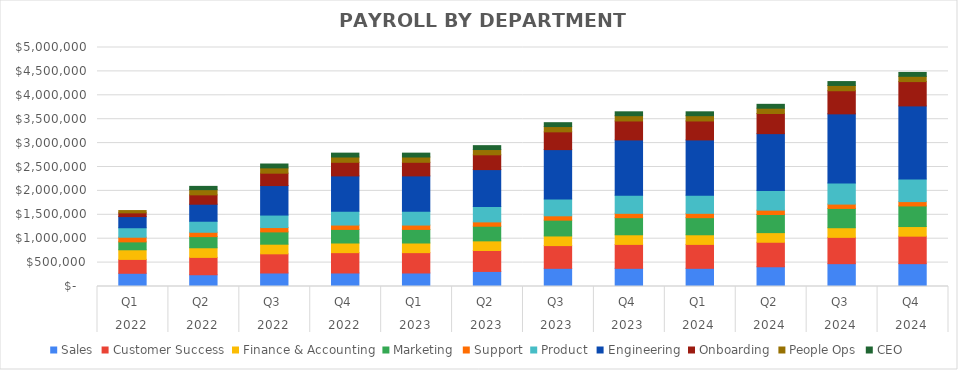
| Category | Sales | Customer Success | Finance & Accounting | Marketing | Support | Product | Engineering | Onboarding | People Ops | CEO |
|---|---|---|---|---|---|---|---|---|---|---|
| 0 | 276249.99 | 290328.92 | 201499.98 | 165482.88 | 97360.24 | 198249.99 | 233088.89 | 78419.34 | 48087.9 | 0 |
| 1 | 245923.65 | 363042.99 | 201499.98 | 232916.61 | 91234.74 | 230749.99 | 355874.98 | 196083.31 | 108784.74 | 68611.1 |
| 2 | 282750 | 400833.26 | 201499.98 | 257291.61 | 91000.02 | 261083.32 | 616940.84 | 259458.29 | 110500.02 | 81249.99 |
| 3 | 282750 | 425749.92 | 201499.98 | 284374.95 | 91000.02 | 289249.98 | 739374.99 | 284374.95 | 110500.02 | 81249.99 |
| 4 | 282750 | 425749.92 | 201499.98 | 284374.95 | 91000.02 | 289249.98 | 739374.99 | 284374.95 | 110500.02 | 81249.99 |
| 5 | 315250 | 438208.25 | 201499.98 | 306041.61 | 91000.02 | 321749.98 | 771874.99 | 309291.61 | 110500.02 | 81249.99 |
| 6 | 380250 | 475583.24 | 201499.98 | 330416.61 | 91000.02 | 352083.31 | 1032940.85 | 371583.26 | 110500.02 | 81249.99 |
| 7 | 380250 | 500499.9 | 201499.98 | 357499.95 | 91000.02 | 380249.97 | 1155375 | 396499.92 | 110500.02 | 81249.99 |
| 8 | 380250 | 500499.9 | 201499.98 | 357499.95 | 91000.02 | 380249.97 | 1155375 | 396499.92 | 110500.02 | 81249.99 |
| 9 | 412750 | 512958.23 | 201499.98 | 379166.61 | 91000.02 | 412749.97 | 1187875 | 421416.58 | 110500.02 | 81249.99 |
| 10 | 477750 | 550333.22 | 201499.98 | 403541.61 | 91000.02 | 443083.3 | 1444572.58 | 483708.23 | 110500.02 | 81249.99 |
| 11 | 477750 | 575249.88 | 201499.98 | 430624.95 | 91000.02 | 471249.96 | 1530750 | 508624.89 | 110500.02 | 81249.99 |